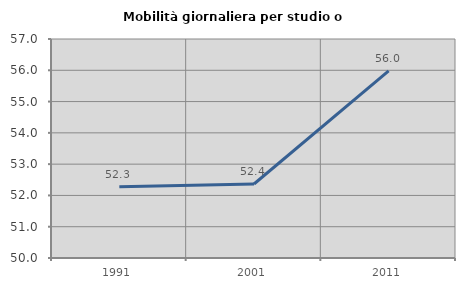
| Category | Mobilità giornaliera per studio o lavoro |
|---|---|
| 1991.0 | 52.276 |
| 2001.0 | 52.366 |
| 2011.0 | 55.984 |